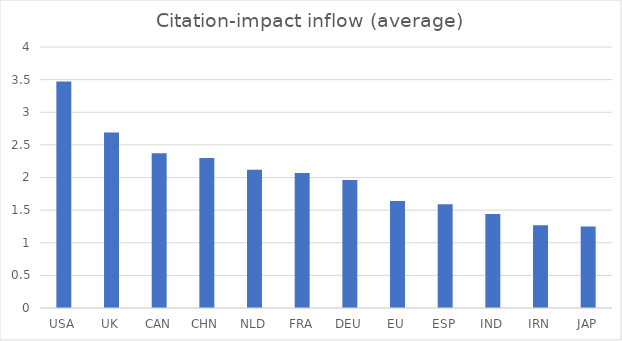
| Category | Citation-impact inflow (average) |
|---|---|
| USA | 3.47 |
| UK | 2.69 |
| CAN | 2.37 |
| CHN | 2.3 |
| NLD | 2.12 |
| FRA | 2.07 |
| DEU | 1.96 |
| EU | 1.64 |
| ESP | 1.59 |
| IND | 1.44 |
| IRN | 1.27 |
| JAP | 1.25 |